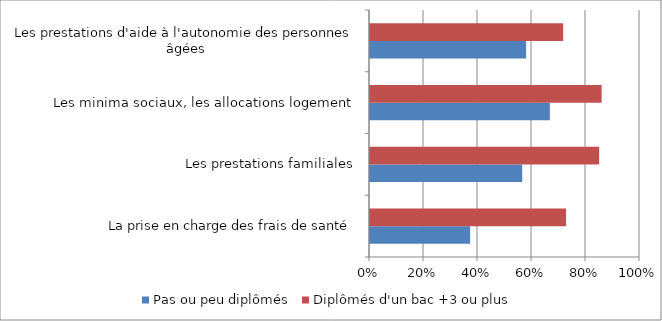
| Category | Pas ou peu diplômés | Diplômés d'un bac +3 ou plus |
|---|---|---|
| La prise en charge des frais de santé | 0.371 | 0.726 |
| Les prestations familiales | 0.564 | 0.849 |
| Les minima sociaux, les allocations logement | 0.666 | 0.858 |
| Les prestations d'aide à l'autonomie des personnes âgées | 0.578 | 0.715 |